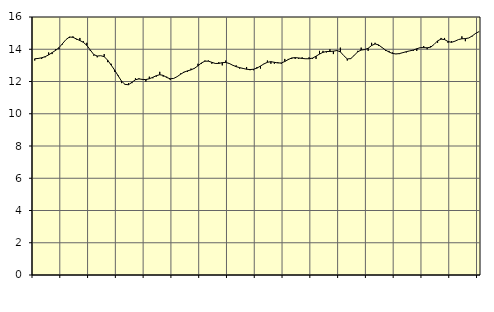
| Category | Piggar | Handel, SNI 45-47 |
|---|---|---|
| nan | 13.3 | 13.41 |
| 87.0 | 13.4 | 13.43 |
| 87.0 | 13.4 | 13.47 |
| 87.0 | 13.5 | 13.54 |
| nan | 13.8 | 13.65 |
| 88.0 | 13.7 | 13.79 |
| 88.0 | 14 | 13.93 |
| 88.0 | 14 | 14.1 |
| nan | 14.3 | 14.35 |
| 89.0 | 14.6 | 14.6 |
| 89.0 | 14.7 | 14.76 |
| 89.0 | 14.8 | 14.74 |
| nan | 14.6 | 14.64 |
| 90.0 | 14.7 | 14.54 |
| 90.0 | 14.5 | 14.43 |
| 90.0 | 14.4 | 14.24 |
| nan | 13.9 | 13.95 |
| 91.0 | 13.6 | 13.67 |
| 91.0 | 13.5 | 13.58 |
| 91.0 | 13.6 | 13.6 |
| nan | 13.7 | 13.54 |
| 92.0 | 13.2 | 13.32 |
| 92.0 | 13.1 | 13.02 |
| 92.0 | 12.6 | 12.71 |
| nan | 12.4 | 12.36 |
| 93.0 | 11.9 | 12.02 |
| 93.0 | 11.8 | 11.82 |
| 93.0 | 11.9 | 11.8 |
| nan | 11.9 | 11.95 |
| 94.0 | 12.2 | 12.11 |
| 94.0 | 12.2 | 12.16 |
| 94.0 | 12.1 | 12.13 |
| nan | 12 | 12.12 |
| 95.0 | 12.3 | 12.17 |
| 95.0 | 12.2 | 12.26 |
| 95.0 | 12.3 | 12.36 |
| nan | 12.6 | 12.42 |
| 96.0 | 12.3 | 12.38 |
| 96.0 | 12.3 | 12.25 |
| 96.0 | 12.1 | 12.17 |
| nan | 12.2 | 12.19 |
| 97.0 | 12.3 | 12.3 |
| 97.0 | 12.5 | 12.45 |
| 97.0 | 12.6 | 12.58 |
| nan | 12.6 | 12.66 |
| 98.0 | 12.8 | 12.72 |
| 98.0 | 12.8 | 12.82 |
| 98.0 | 13.1 | 12.97 |
| nan | 13.1 | 13.15 |
| 99.0 | 13.3 | 13.26 |
| 99.0 | 13.3 | 13.26 |
| 99.0 | 13.1 | 13.19 |
| nan | 13.1 | 13.12 |
| 0.0 | 13.2 | 13.12 |
| 0.0 | 13 | 13.17 |
| 0.0 | 13.3 | 13.18 |
| nan | 13.1 | 13.12 |
| 1.0 | 13 | 13.01 |
| 1.0 | 13 | 12.92 |
| 1.0 | 12.8 | 12.86 |
| nan | 12.8 | 12.81 |
| 2.0 | 12.9 | 12.76 |
| 2.0 | 12.7 | 12.74 |
| 2.0 | 12.7 | 12.76 |
| nan | 12.9 | 12.83 |
| 3.0 | 12.8 | 12.96 |
| 3.0 | 13.1 | 13.09 |
| 3.0 | 13.3 | 13.19 |
| nan | 13.1 | 13.23 |
| 4.0 | 13.1 | 13.19 |
| 4.0 | 13.2 | 13.15 |
| 4.0 | 13.1 | 13.15 |
| nan | 13.4 | 13.24 |
| 5.0 | 13.4 | 13.36 |
| 5.0 | 13.4 | 13.46 |
| 5.0 | 13.4 | 13.48 |
| nan | 13.4 | 13.46 |
| 6.0 | 13.5 | 13.43 |
| 6.0 | 13.4 | 13.41 |
| 6.0 | 13.5 | 13.41 |
| nan | 13.4 | 13.45 |
| 7.0 | 13.4 | 13.57 |
| 7.0 | 13.9 | 13.7 |
| 7.0 | 13.9 | 13.81 |
| nan | 13.8 | 13.86 |
| 8.0 | 14 | 13.86 |
| 8.0 | 13.7 | 13.88 |
| 8.0 | 13.9 | 13.92 |
| nan | 14.1 | 13.84 |
| 9.0 | 13.6 | 13.6 |
| 9.0 | 13.3 | 13.4 |
| 9.0 | 13.4 | 13.42 |
| nan | 13.6 | 13.62 |
| 10.0 | 13.9 | 13.84 |
| 10.0 | 14.1 | 13.95 |
| 10.0 | 14 | 13.98 |
| nan | 13.9 | 14.06 |
| 11.0 | 14.4 | 14.23 |
| 11.0 | 14.4 | 14.33 |
| 11.0 | 14.2 | 14.27 |
| nan | 14.1 | 14.11 |
| 12.0 | 13.9 | 13.95 |
| 12.0 | 13.9 | 13.83 |
| 12.0 | 13.8 | 13.74 |
| nan | 13.7 | 13.71 |
| 13.0 | 13.7 | 13.73 |
| 13.0 | 13.8 | 13.79 |
| 13.0 | 13.8 | 13.85 |
| nan | 13.9 | 13.9 |
| 14.0 | 13.9 | 13.95 |
| 14.0 | 13.9 | 14.03 |
| 14.0 | 14.1 | 14.1 |
| nan | 14.2 | 14.1 |
| 15.0 | 14 | 14.09 |
| 15.0 | 14.2 | 14.13 |
| 15.0 | 14.3 | 14.3 |
| nan | 14.4 | 14.52 |
| 16.0 | 14.7 | 14.63 |
| 16.0 | 14.7 | 14.6 |
| 16.0 | 14.4 | 14.48 |
| nan | 14.5 | 14.43 |
| 17.0 | 14.5 | 14.5 |
| 17.0 | 14.6 | 14.6 |
| 17.0 | 14.8 | 14.65 |
| nan | 14.5 | 14.66 |
| 18.0 | 14.7 | 14.7 |
| 18.0 | 14.8 | 14.83 |
| 18.0 | 15 | 14.99 |
| nan | 15.1 | 15.1 |